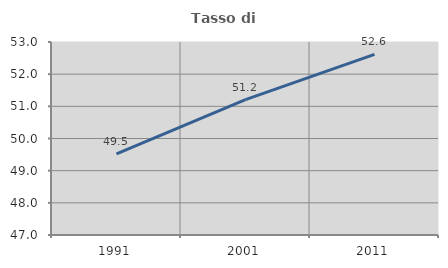
| Category | Tasso di occupazione   |
|---|---|
| 1991.0 | 49.519 |
| 2001.0 | 51.211 |
| 2011.0 | 52.615 |